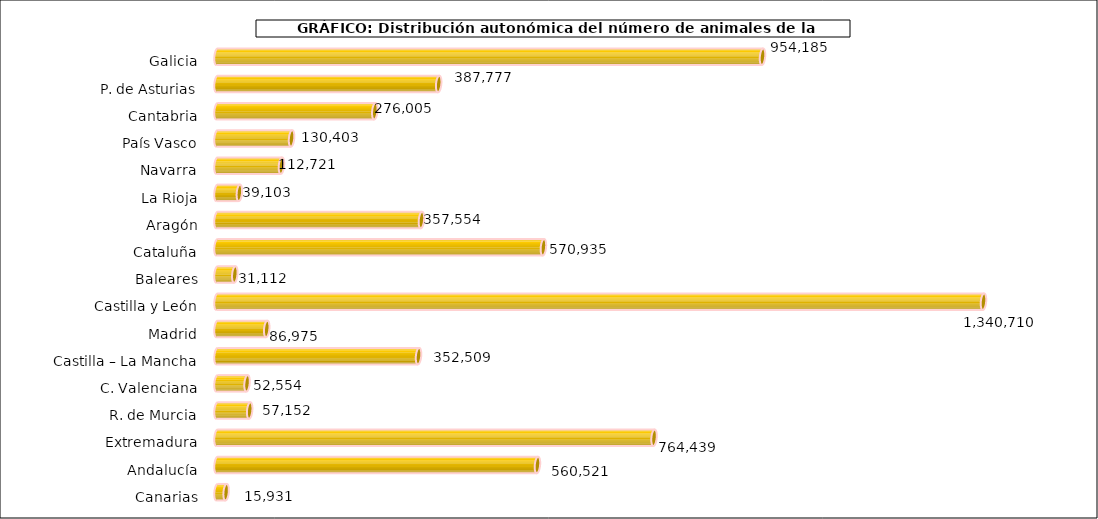
| Category | num. Animales |
|---|---|
| 0 | 954185 |
| 1 | 387777 |
| 2 | 276005 |
| 3 | 130403 |
| 4 | 112721 |
| 5 | 39103 |
| 6 | 357554 |
| 7 | 570935 |
| 8 | 31112 |
| 9 | 1340710 |
| 10 | 86975 |
| 11 | 352509 |
| 12 | 52554 |
| 13 | 57152 |
| 14 | 764439 |
| 15 | 560521 |
| 16 | 15931 |